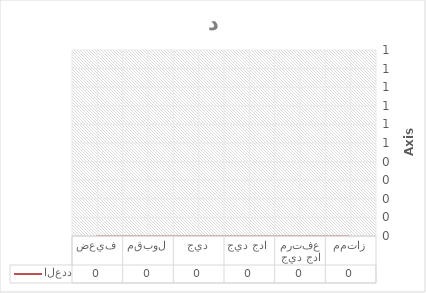
| Category | العدد |
|---|---|
| ممتاز | 0 |
| جيد جدا مرتفع | 0 |
| جيد جدا  | 0 |
| جيد | 0 |
| مقبول | 0 |
| ضعيف | 0 |